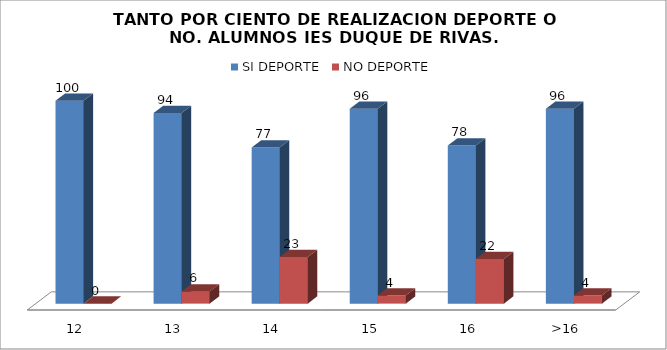
| Category | SI DEPORTE | NO DEPORTE |
|---|---|---|
| 12 | 100 | 0 |
| 13 | 94 | 6 |
| 14 | 77 | 23 |
| 15 | 96 | 4 |
| 16 | 78 | 22 |
| >16 | 96 | 4 |